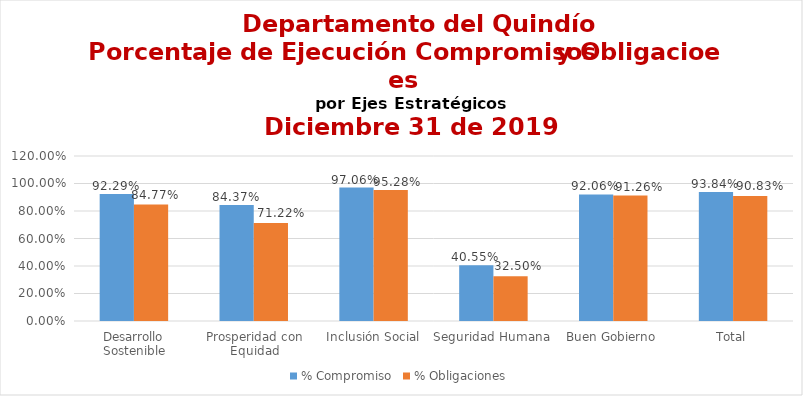
| Category | % Compromiso | % Obligaciones |
|---|---|---|
| Desarrollo Sostenible | 0.923 | 0.848 |
| Prosperidad con Equidad | 0.844 | 0.712 |
| Inclusión Social | 0.971 | 0.953 |
| Seguridad Humana | 0.405 | 0.325 |
| Buen Gobierno | 0.921 | 0.913 |
| Total | 0.938 | 0.908 |